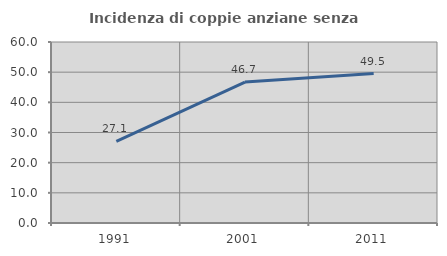
| Category | Incidenza di coppie anziane senza figli  |
|---|---|
| 1991.0 | 27.052 |
| 2001.0 | 46.702 |
| 2011.0 | 49.545 |